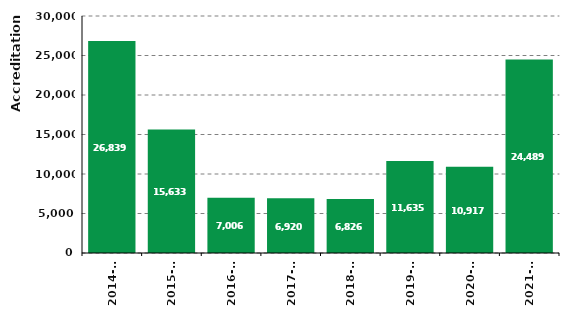
| Category | Accreditations |
|---|---|
| 2014-15 | 26839 |
| 2015-16 | 15633 |
| 2016-17 | 7006 |
| 2017-18 | 6920 |
| 2018-19 | 6826 |
| 2019-20 | 11635 |
| 2020-21 | 10917 |
| 2021-22 | 24489 |